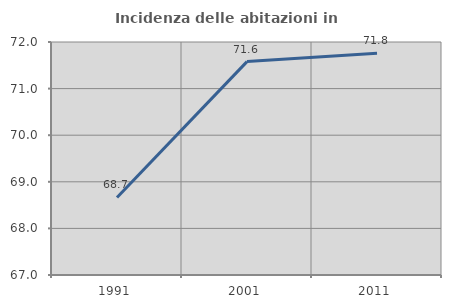
| Category | Incidenza delle abitazioni in proprietà  |
|---|---|
| 1991.0 | 68.663 |
| 2001.0 | 71.58 |
| 2011.0 | 71.758 |